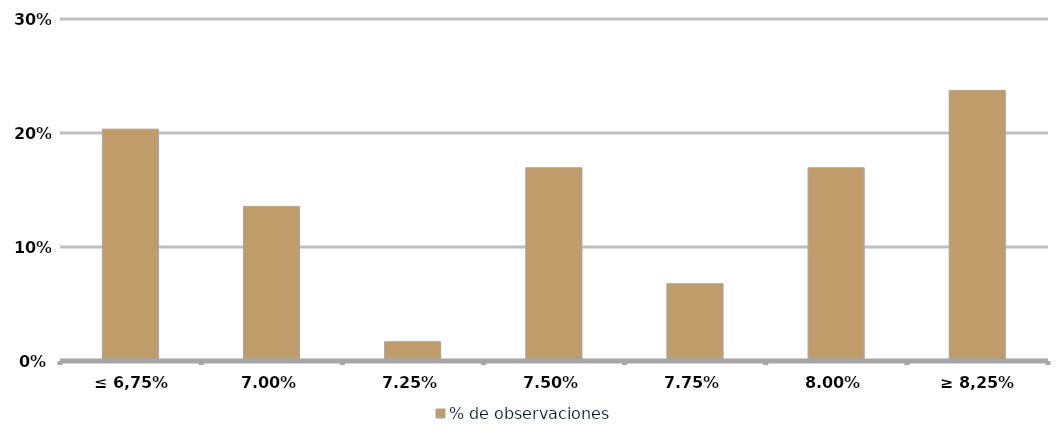
| Category | % de observaciones  |
|---|---|
| ≤ 6,75% | 0.203 |
| 7,00% | 0.136 |
| 7,25% | 0.017 |
| 7,50% | 0.169 |
| 7,75% | 0.068 |
| 8,00% | 0.169 |
| ≥ 8,25% | 0.237 |